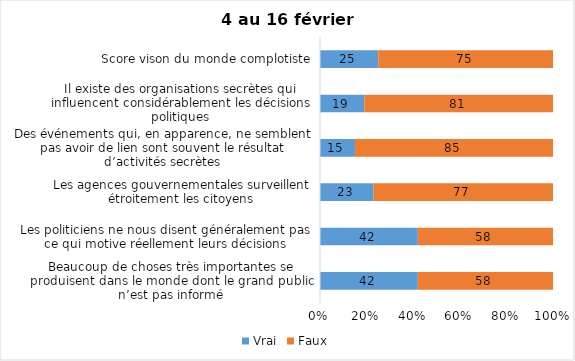
| Category | Vrai | Faux |
|---|---|---|
| Beaucoup de choses très importantes se produisent dans le monde dont le grand public n’est pas informé | 42 | 58 |
| Les politiciens ne nous disent généralement pas ce qui motive réellement leurs décisions | 42 | 58 |
| Les agences gouvernementales surveillent étroitement les citoyens | 23 | 77 |
| Des événements qui, en apparence, ne semblent pas avoir de lien sont souvent le résultat d’activités secrètes | 15 | 85 |
| Il existe des organisations secrètes qui influencent considérablement les décisions politiques | 19 | 81 |
| Score vison du monde complotiste | 25 | 75 |